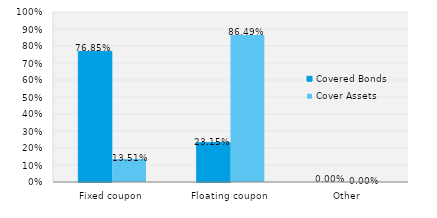
| Category | Covered Bonds | Cover Assets |
|---|---|---|
| Fixed coupon | 0.769 | 0.135 |
| Floating coupon | 0.231 | 0.865 |
| Other | 0 | 0 |